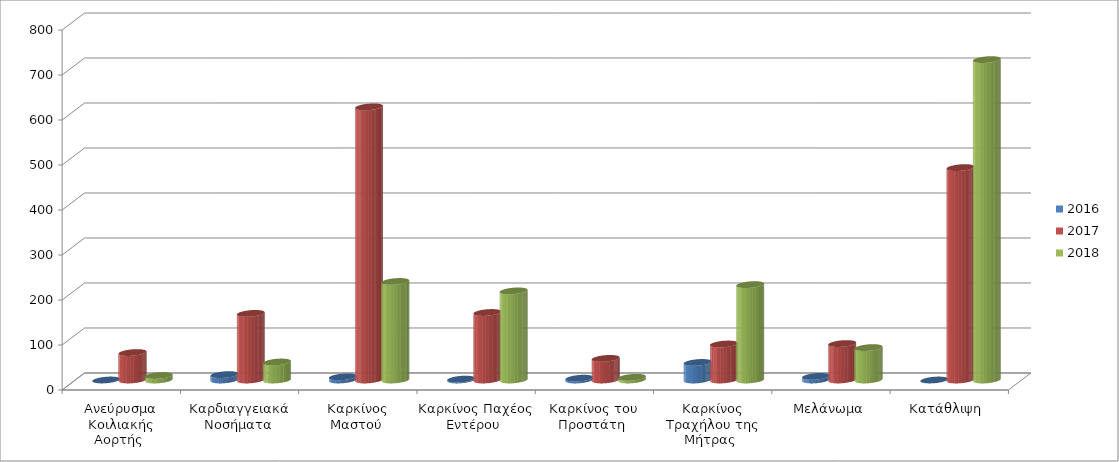
| Category | 2016 | 2017 | 2018 |
|---|---|---|---|
| Ανεύρυσμα Κοιλιακής Αορτής  | 0 | 61 | 10 |
| Καρδιαγγειακά Νοσήματα | 12 | 148 | 40 |
| Καρκίνος Μαστού  | 7 | 607 | 219 |
| Καρκίνος Παχέος Εντέρου  | 2 | 150 | 198 |
| Καρκίνος του Προστάτη  | 4 | 48 | 6 |
| Καρκίνος Τραχήλου της Μήτρας  | 39 | 80 | 212 |
| Μελάνωμα | 8 | 81 | 72 |
| Κατάθλιψη  | 0 | 472 | 712 |